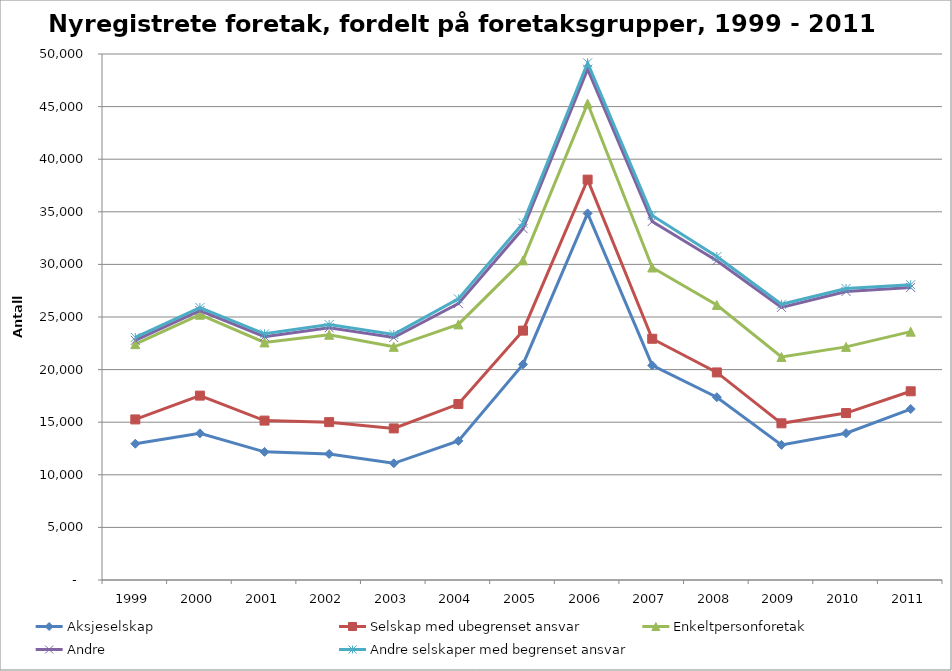
| Category | Aksjeselskap | Selskap med ubegrenset ansvar | Enkeltpersonforetak | Andre | Andre selskaper med begrenset ansvar |
|---|---|---|---|---|---|
| 1999.0 | 12955 | 2309 | 7154 | 360 | 275 |
| 2000.0 | 13942 | 3585 | 7688 | 401 | 284 |
| 2001.0 | 12180 | 2972 | 7429 | 550 | 271 |
| 2002.0 | 11981 | 3025 | 8306 | 663 | 307 |
| 2003.0 | 11093 | 3318 | 7755 | 880 | 298 |
| 2004.0 | 13225 | 3502 | 7571 | 1979 | 446 |
| 2005.0 | 20497 | 3208 | 6680 | 3018 | 517 |
| 2006.0 | 34849 | 3209 | 7232 | 3265 | 608 |
| 2007.0 | 20395 | 2536 | 6774 | 4377 | 573 |
| 2008.0 | 17379 | 2352 | 6411 | 4208 | 393 |
| 2009.0 | 12845 | 2050 | 6303 | 4716 | 296 |
| 2010.0 | 13956 | 1913 | 6290 | 5270 | 277 |
| 2011.0 | 16250 | 1689 | 5667 | 4202 | 262 |